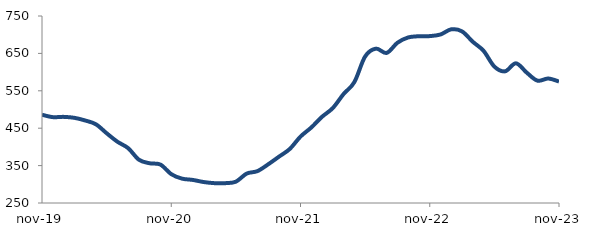
| Category | Series 0 |
|---|---|
| 2019-11-01 | 485.887 |
| 2019-12-01 | 479.593 |
| 2020-01-01 | 480.293 |
| 2020-02-01 | 477.774 |
| 2020-03-01 | 470.708 |
| 2020-04-01 | 460.537 |
| 2020-05-01 | 436.562 |
| 2020-06-01 | 413.857 |
| 2020-07-01 | 396.652 |
| 2020-08-01 | 365.687 |
| 2020-09-01 | 356.18 |
| 2020-10-01 | 352.658 |
| 2020-11-01 | 327.164 |
| 2020-12-01 | 315.173 |
| 2021-01-01 | 311.708 |
| 2021-02-01 | 306.103 |
| 2021-03-01 | 303.075 |
| 2021-04-01 | 303.034 |
| 2021-05-01 | 306.996 |
| 2021-06-01 | 328.614 |
| 2021-07-01 | 335.232 |
| 2021-08-01 | 353.414 |
| 2021-09-01 | 373.869 |
| 2021-10-01 | 394.393 |
| 2021-11-01 | 427.592 |
| 2021-12-01 | 451.83 |
| 2022-01-01 | 480.528 |
| 2022-02-01 | 503.882 |
| 2022-03-01 | 541.428 |
| 2022-04-01 | 573.261 |
| 2022-05-01 | 641.774 |
| 2022-06-01 | 662.728 |
| 2022-07-01 | 651.267 |
| 2022-08-01 | 678.506 |
| 2022-09-01 | 692.688 |
| 2022-10-01 | 695.873 |
| 2022-11-01 | 696.235 |
| 2022-12-01 | 700.598 |
| 2023-01-01 | 714.422 |
| 2023-02-01 | 708.75 |
| 2023-03-01 | 680.994 |
| 2023-04-01 | 656.708 |
| 2023-05-01 | 614.698 |
| 2023-06-01 | 602.139 |
| 2023-07-01 | 623.52 |
| 2023-08-01 | 598.686 |
| 2023-09-01 | 577.1 |
| 2023-10-01 | 582.836 |
| 2023-11-01 | 574.767 |